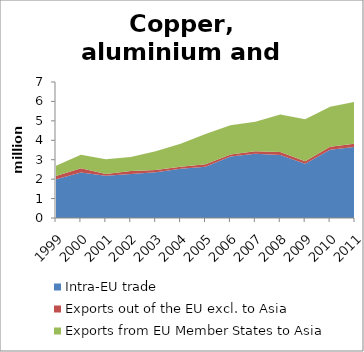
| Category | Intra-EU trade | Exports out of the EU excl. to Asia | Exports from EU Member States to Asia |
|---|---|---|---|
| 1999.0 | 1.994 | 0.17 | 0.526 |
| 2000.0 | 2.346 | 0.219 | 0.693 |
| 2001.0 | 2.175 | 0.092 | 0.751 |
| 2002.0 | 2.271 | 0.149 | 0.716 |
| 2003.0 | 2.358 | 0.114 | 0.968 |
| 2004.0 | 2.532 | 0.111 | 1.179 |
| 2005.0 | 2.643 | 0.122 | 1.553 |
| 2006.0 | 3.17 | 0.104 | 1.501 |
| 2007.0 | 3.311 | 0.126 | 1.514 |
| 2008.0 | 3.24 | 0.154 | 1.927 |
| 2009.0 | 2.791 | 0.124 | 2.17 |
| 2010.0 | 3.518 | 0.145 | 2.069 |
| 2011.0 | 3.663 | 0.17 | 2.147 |